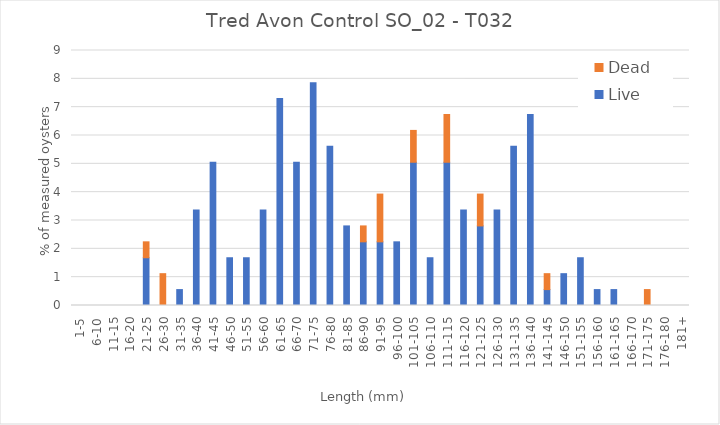
| Category | Live | Dead |
|---|---|---|
| 1-5 | 0 | 0 |
| 6-10 | 0 | 0 |
| 11-15 | 0 | 0 |
| 16-20 | 0 | 0 |
| 21-25 | 1.685 | 0.562 |
| 26-30 | 0 | 1.124 |
| 31-35 | 0.562 | 0 |
| 36-40 | 3.371 | 0 |
| 41-45 | 5.056 | 0 |
| 46-50 | 1.685 | 0 |
| 51-55 | 1.685 | 0 |
| 56-60 | 3.371 | 0 |
| 61-65 | 7.303 | 0 |
| 66-70 | 5.056 | 0 |
| 71-75 | 7.865 | 0 |
| 76-80 | 5.618 | 0 |
| 81-85 | 2.809 | 0 |
| 86-90 | 2.247 | 0.562 |
| 91-95 | 2.247 | 1.685 |
| 96-100 | 2.247 | 0 |
| 101-105 | 5.056 | 1.124 |
| 106-110 | 1.685 | 0 |
| 111-115 | 5.056 | 1.685 |
| 116-120 | 3.371 | 0 |
| 121-125 | 2.809 | 1.124 |
| 126-130 | 3.371 | 0 |
| 131-135 | 5.618 | 0 |
| 136-140 | 6.742 | 0 |
| 141-145 | 0.562 | 0.562 |
| 146-150 | 1.124 | 0 |
| 151-155 | 1.685 | 0 |
| 156-160 | 0.562 | 0 |
| 161-165 | 0.562 | 0 |
| 166-170 | 0 | 0 |
| 171-175 | 0 | 0.562 |
| 176-180 | 0 | 0 |
| 181+ | 0 | 0 |